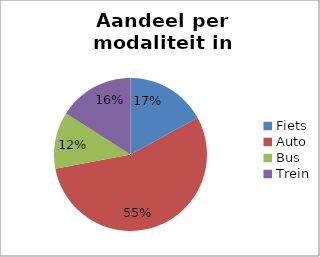
| Category | Series 0 |
|---|---|
| Fiets | 0.17 |
| Auto | 0.55 |
| Bus | 0.12 |
| Trein | 0.16 |